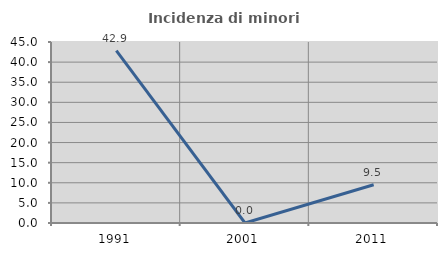
| Category | Incidenza di minori stranieri |
|---|---|
| 1991.0 | 42.857 |
| 2001.0 | 0 |
| 2011.0 | 9.524 |